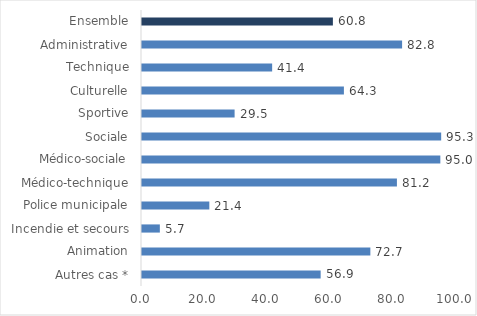
| Category | Series 0 |
|---|---|
| Autres cas * | 56.896 |
| Animation | 72.724 |
| Incendie et secours | 5.683 |
| Police municipale | 21.442 |
| Médico-technique | 81.185 |
| Médico-sociale | 95.01 |
| Sociale | 95.278 |
| Sportive | 29.492 |
| Culturelle | 64.299 |
| Technique | 41.449 |
| Administrative | 82.835 |
| Ensemble | 60.793 |